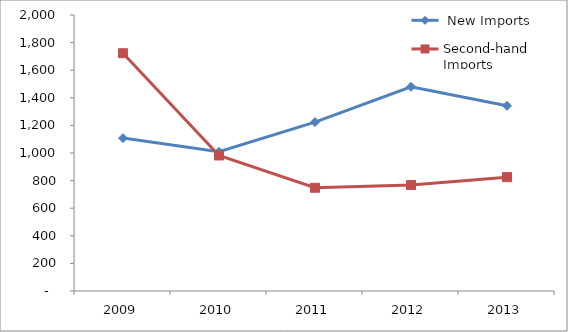
| Category |  New Imports | Second-hand Imports |
|---|---|---|
| 2009.0 | 1108 | 1723 |
| 2010.0 | 1009 | 982 |
| 2011.0 | 1224 | 748 |
| 2012.0 | 1480 | 768 |
| 2013.0 | 1342 | 825 |